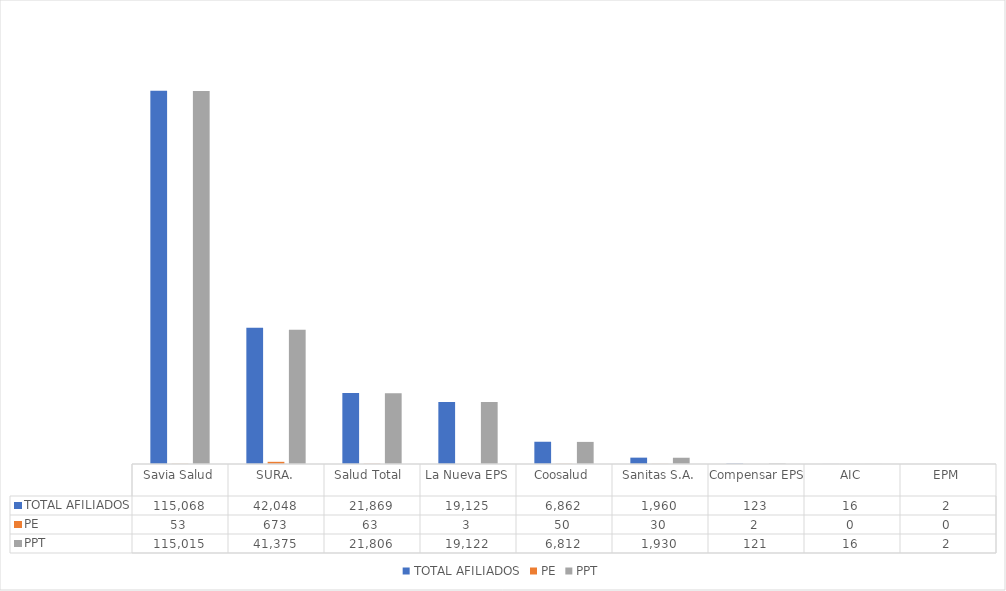
| Category | TOTAL AFILIADOS | PE | PPT |
|---|---|---|---|
| Savia Salud | 115068 | 53 | 115015 |
| SURA. | 42048 | 673 | 41375 |
| Salud Total  | 21869 | 63 | 21806 |
| La Nueva EPS | 19125 | 3 | 19122 |
| Coosalud | 6862 | 50 | 6812 |
| Sanitas S.A. | 1960 | 30 | 1930 |
| Compensar EPS | 123 | 2 | 121 |
| AIC | 16 | 0 | 16 |
| EPM | 2 | 0 | 2 |